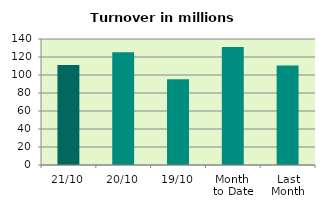
| Category | Series 0 |
|---|---|
| 21/10 | 111.039 |
| 20/10 | 125.412 |
| 19/10 | 95.396 |
| Month 
to Date | 131.187 |
| Last
Month | 110.611 |